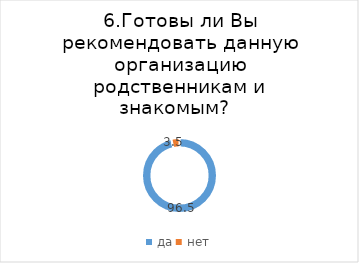
| Category | Series 0 |
|---|---|
| да | 96.503 |
| нет | 3.497 |